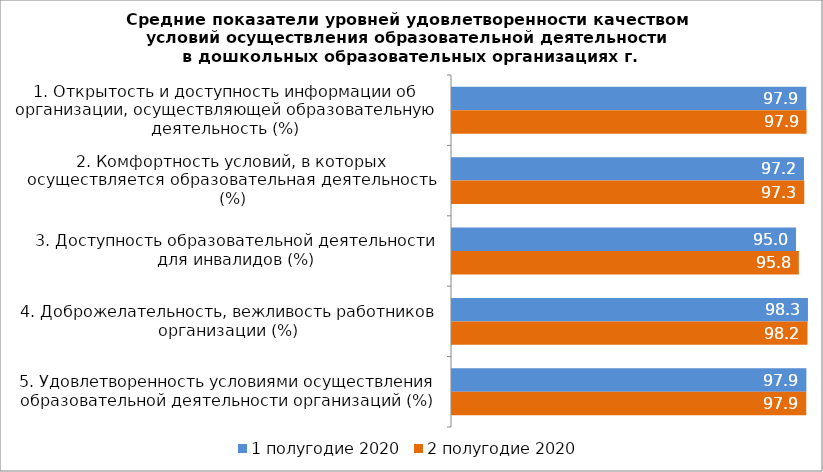
| Category | 1 полугодие 2020 | 2 полугодие 2020 |
|---|---|---|
| 1. Открытость и доступность информации об организации, осуществляющей образовательную деятельность (%) | 97.87 | 97.937 |
| 2. Комфортность условий, в которых осуществляется образовательная деятельность (%) | 97.23 | 97.306 |
| 3. Доступность образовательной деятельности для инвалидов (%) | 95.031 | 95.806 |
| 4. Доброжелательность, вежливость работников организации (%) | 98.332 | 98.201 |
| 5. Удовлетворенность условиями осуществления образовательной деятельности организаций (%) | 97.896 | 97.86 |